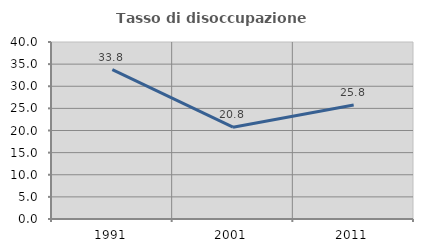
| Category | Tasso di disoccupazione giovanile  |
|---|---|
| 1991.0 | 33.772 |
| 2001.0 | 20.755 |
| 2011.0 | 25.751 |